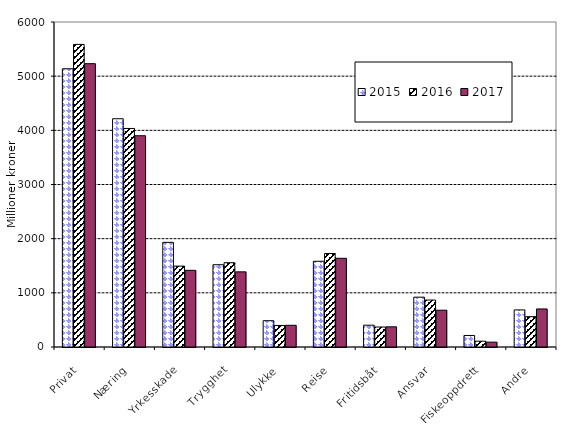
| Category | 2015 | 2016 | 2017 |
|---|---|---|---|
| Privat | 5136.589 | 5586.44 | 5230.751 |
| Næring | 4213.957 | 4034.605 | 3900.576 |
| Yrkesskade | 1931.922 | 1493.239 | 1415.352 |
| Trygghet | 1519.225 | 1556.112 | 1387.375 |
| Ulykke | 485.321 | 397.935 | 401.14 |
| Reise | 1582.571 | 1725.945 | 1637.637 |
| Fritidsbåt | 402.521 | 368.91 | 372.468 |
| Ansvar | 920.036 | 866.963 | 679.313 |
| Fiskeoppdrett | 213.021 | 107.127 | 89.79 |
| Andre | 684.532 | 559.916 | 702.444 |